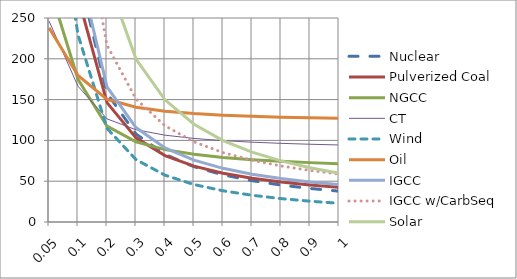
| Category | Nuclear | Pulverized Coal | NGCC | CT | Wind | Oil | IGCC | IGCC w/CarbSeq | Solar |
|---|---|---|---|---|---|---|---|---|---|
| 0.05 | 607.582 | 535.562 | 289.733 | 246.326 | 459 | 237.934 | 615.559 | 807.597 | 1198.163 |
| 0.1 | 307.691 | 276.061 | 174.867 | 166.363 | 229.5 | 179.567 | 315.668 | 413.501 | 599.081 |
| 0.2 | 157.745 | 146.31 | 117.433 | 126.382 | 114.75 | 150.384 | 165.722 | 216.454 | 299.541 |
| 0.3 | 107.764 | 103.06 | 98.289 | 113.054 | 76.5 | 140.656 | 115.741 | 150.771 | 199.694 |
| 0.4 | 82.773 | 81.435 | 88.717 | 106.391 | 57.375 | 135.792 | 90.75 | 117.93 | 149.77 |
| 0.5 | 67.778 | 68.46 | 82.973 | 102.393 | 45.9 | 132.873 | 75.755 | 98.225 | 119.816 |
| 0.6 | 57.782 | 59.81 | 79.144 | 99.727 | 38.25 | 130.928 | 65.759 | 85.088 | 99.847 |
| 0.7 | 50.642 | 53.632 | 76.41 | 97.823 | 32.786 | 129.538 | 58.619 | 75.705 | 85.583 |
| 0.8 | 45.286 | 48.998 | 74.358 | 96.395 | 28.688 | 128.496 | 53.263 | 68.668 | 74.885 |
| 0.9 | 41.121 | 45.393 | 72.763 | 95.285 | 25.5 | 127.685 | 49.098 | 63.194 | 66.565 |
| 1.0 | 37.789 | 42.51 | 71.487 | 94.396 | 22.95 | 127.037 | 45.766 | 58.815 | 59.908 |